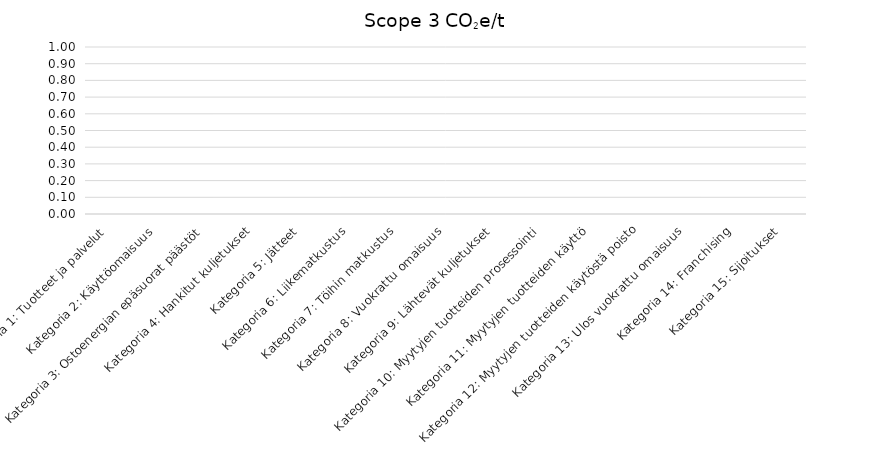
| Category | CO2e/t |
|---|---|
| Kategoria 1: Tuotteet ja palvelut | 0 |
| Kategoria 2: Käyttöomaisuus | 0 |
| Kategoria 3: Ostoenergian epäsuorat päästöt | 0 |
| Kategoria 4: Hankitut kuljetukset | 0 |
| Kategoria 5: Jätteet | 0 |
| Kategoria 6: Liikematkustus | 0 |
| Kategoria 7: Töihin matkustus | 0 |
| Kategoria 8: Vuokrattu omaisuus | 0 |
| Kategoria 9: Lähtevät kuljetukset | 0 |
| Kategoria 10: Myytyjen tuotteiden prosessointi | 0 |
| Kategoria 11: Myytyjen tuotteiden käyttö | 0 |
| Kategoria 12: Myytyjen tuotteiden käytöstä poisto | 0 |
| Kategoria 13: Ulos vuokrattu omaisuus | 0 |
| Kategoria 14: Franchising | 0 |
| Kategoria 15: Sijoitukset | 0 |